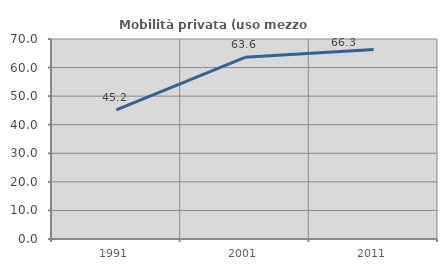
| Category | Mobilità privata (uso mezzo privato) |
|---|---|
| 1991.0 | 45.156 |
| 2001.0 | 63.572 |
| 2011.0 | 66.293 |